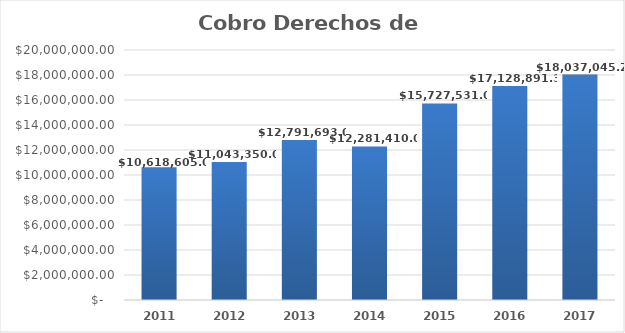
| Category | Cobro Derechos de Agua |
|---|---|
| 2011.0 | 10618605 |
| 2012.0 | 11043350 |
| 2013.0 | 12791693 |
| 2014.0 | 12281410 |
| 2015.0 | 15727531 |
| 2016.0 | 17128891.31 |
| 2017.0 | 18037045.24 |